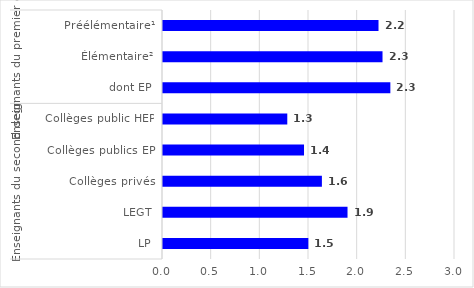
| Category | Series 0 |
|---|---|
| 0 | 2.214 |
| 1 | 2.255 |
| 2 | 2.336 |
| 3 | 1.277 |
| 4 | 1.449 |
| 5 | 1.633 |
| 6 | 1.896 |
| 7 | 1.493 |